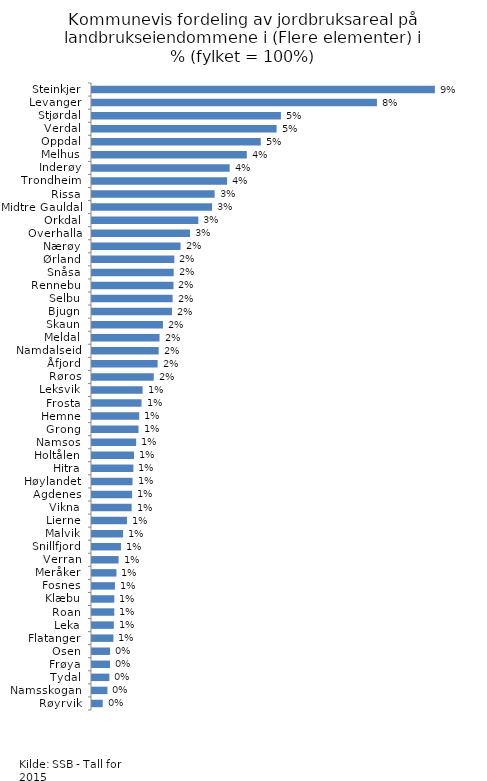
| Category | Totalt |
|---|---|
| Røyrvik | 0.003 |
| Namsskogan | 0.004 |
| Tydal | 0.005 |
| Frøya | 0.005 |
| Osen | 0.005 |
| Flatanger | 0.006 |
| Leka | 0.006 |
| Roan | 0.006 |
| Klæbu | 0.006 |
| Fosnes | 0.006 |
| Meråker | 0.007 |
| Verran | 0.007 |
| Snillfjord | 0.008 |
| Malvik | 0.009 |
| Lierne | 0.01 |
| Vikna | 0.011 |
| Agdenes | 0.011 |
| Høylandet | 0.011 |
| Hitra | 0.011 |
| Holtålen | 0.012 |
| Namsos | 0.012 |
| Grong | 0.013 |
| Hemne | 0.013 |
| Frosta | 0.014 |
| Leksvik | 0.014 |
| Røros | 0.017 |
| Åfjord | 0.018 |
| Namdalseid | 0.018 |
| Meldal | 0.019 |
| Skaun | 0.019 |
| Bjugn | 0.022 |
| Selbu | 0.022 |
| Rennebu | 0.022 |
| Snåsa | 0.022 |
| Ørland | 0.023 |
| Nærøy | 0.024 |
| Overhalla | 0.027 |
| Orkdal | 0.029 |
| Midtre Gauldal | 0.033 |
| Rissa | 0.034 |
| Trondheim | 0.037 |
| Inderøy | 0.038 |
| Melhus | 0.042 |
| Oppdal | 0.046 |
| Verdal | 0.051 |
| Stjørdal | 0.052 |
| Levanger | 0.078 |
| Steinkjer | 0.094 |